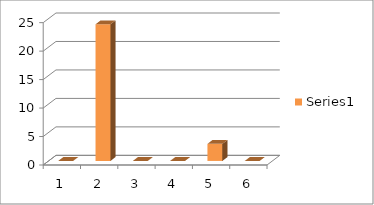
| Category | Series 0 |
|---|---|
| 0 | 0 |
| 1 | 24 |
| 2 | 0 |
| 3 | 0 |
| 4 | 3 |
| 5 | 0 |